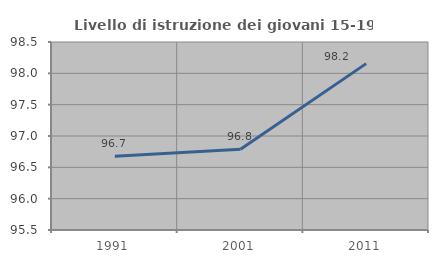
| Category | Livello di istruzione dei giovani 15-19 anni |
|---|---|
| 1991.0 | 96.676 |
| 2001.0 | 96.787 |
| 2011.0 | 98.155 |